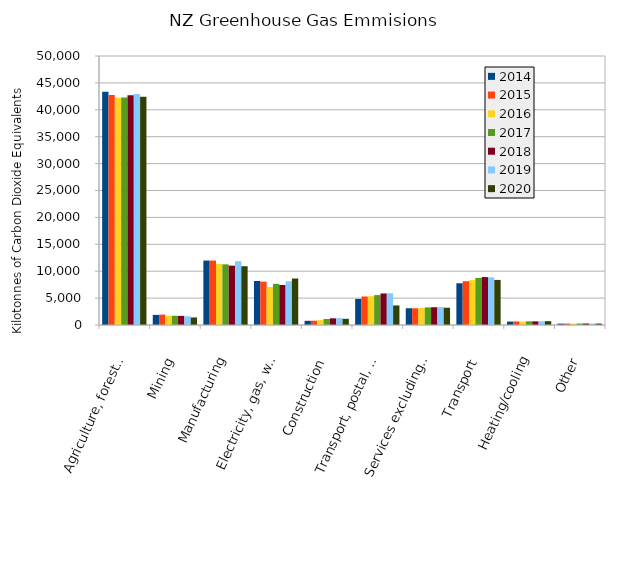
| Category | 2014 | 2015 | 2016 | 2017 | 2018 | 2019 | 2020 |
|---|---|---|---|---|---|---|---|
| Agriculture, forestry, and fishing | 43359 | 42729 | 42228 | 42300 | 42706 | 42959 | 42448 |
| Mining | 1875 | 1933 | 1725 | 1722 | 1696 | 1619 | 1400 |
| Manufacturing | 11977 | 11978 | 11367 | 11277 | 11030 | 11866 | 10925 |
| Electricity, gas, water, and waste services | 8182 | 8057 | 7060 | 7650 | 7437 | 8126 | 8640 |
| Construction | 779 | 797 | 906 | 1120 | 1245 | 1269 | 1148 |
| Transport, postal, and warehousing | 4840 | 5295 | 5359 | 5558 | 5862 | 5895 | 3637 |
| Services excluding transport, postal, and warehousing | 3114 | 3111 | 3155 | 3270 | 3300 | 3336 | 3209 |
| Transport | 7760 | 8143 | 8333 | 8757 | 8903 | 8869 | 8380 |
| Heating/cooling | 636 | 667 | 645 | 678 | 678 | 686 | 713 |
| Other | 253 | 264 | 270 | 275 | 277 | 272 | 269 |